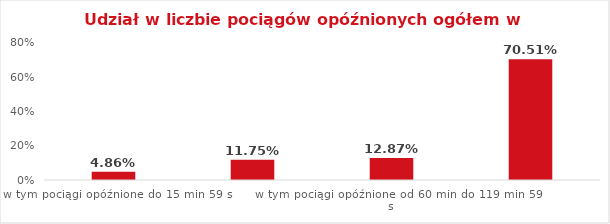
| Category | Series 0 |
|---|---|
| w tym pociągi opóźnione do 15 min 59 s | 0.049 |
| w tym pociągi opóźnione od 16 min do 59 min 59 s | 0.118 |
| w tym pociągi opóźnione od 60 min do 119 min 59 s | 0.129 |
| w tym pociągi opóźnione od 120 min | 0.705 |